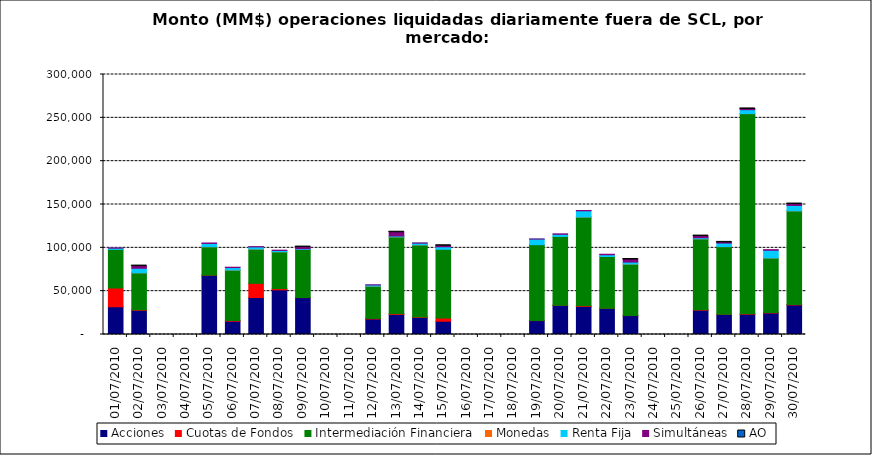
| Category | Acciones | Cuotas de Fondos | Intermediación Financiera | Monedas | Renta Fija | Simultáneas | AO |
|---|---|---|---|---|---|---|---|
| 01/07/2010 | 31971.398 | 21709.59 | 44536.904 | 0 | 1418.736 | 236.081 | 0 |
| 02/07/2010 | 27828.15 | 633.668 | 42697.035 | 1.546 | 5266.546 | 2490.681 | 0.496 |
| 05/07/2010 | 68374.527 | 124.416 | 32745.552 | 10.664 | 3793.346 | 549.216 | 0 |
| 06/07/2010 | 15330.407 | 807.544 | 58236.372 | 6.381 | 2822.67 | 421.409 | 0 |
| 07/07/2010 | 42602.789 | 16407.149 | 39562.713 | 7.575 | 2499.655 | 292.936 | 0 |
| 08/07/2010 | 51507.402 | 1444.375 | 42503.816 | 7.112 | 1502.222 | 316.118 | 0 |
| 09/07/2010 | 42550.976 | 126.98 | 55365.275 | 0 | 888.805 | 1915.865 | 1.38 |
| 12/07/2010 | 17907.16 | 601.648 | 37295.361 | 2.382 | 1343.975 | 151.056 | 0 |
| 13/07/2010 | 23038.837 | 999.601 | 88600.355 | 24.094 | 997.019 | 4322.596 | 0.101 |
| 14/07/2010 | 19624.616 | 629.459 | 83124.405 | 1.84 | 2014.386 | 264.741 | 0 |
| 15/07/2010 | 15273.114 | 3683.002 | 79364.127 | 0 | 2890.749 | 1153.219 | 0.029 |
| 19/07/2010 | 16002.661 | 124.848 | 87508.532 | 0 | 6437.874 | 173.381 | 0 |
| 20/07/2010 | 33648.248 | 108.904 | 79393.461 | 0 | 2450.584 | 518.673 | 0 |
| 21/07/2010 | 32352.845 | 793.282 | 102386.61 | 4.14 | 7174.012 | 347.36 | 0 |
| 22/07/2010 | 30097.205 | 160.432 | 59734.264 | 3.16 | 2028.71 | 585.632 | 0 |
| 23/07/2010 | 21796.812 | 108.374 | 59369.403 | 8.334 | 2286.87 | 2947.182 | 0.14 |
| 26/07/2010 | 28035.783 | 384.66 | 81963.736 | 2.786 | 1235.635 | 1897.149 | 0.216 |
| 27/07/2010 | 23201.2 | 149.585 | 78047.842 | 3.125 | 4084.257 | 785.642 | 0.038 |
| 28/07/2010 | 23408.63 | 510.405 | 230938.277 | 14.751 | 4548.335 | 842.573 | 0.011 |
| 29/07/2010 | 24795.891 | 464.994 | 63059.036 | 9.76 | 8825.279 | 747.866 | 0 |
| 30/07/2010 | 34084.692 | 573.712 | 108003.227 | 0.393 | 6227.785 | 1611.228 | 0.01 |